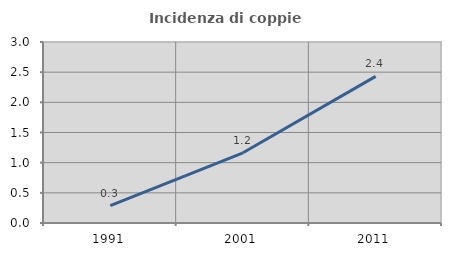
| Category | Incidenza di coppie miste |
|---|---|
| 1991.0 | 0.287 |
| 2001.0 | 1.163 |
| 2011.0 | 2.43 |